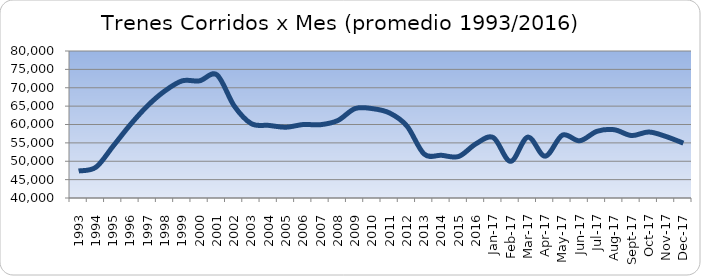
| Category | Series 0 |
|---|---|
| 1993.0 | 47344.667 |
| 1994.0 | 48375 |
| 1995.0 | 54141.667 |
| 1996.0 | 60006.5 |
| 1997.0 | 65151.083 |
| 1998.0 | 69168.25 |
| 1999.0 | 71890.333 |
| 2000.0 | 71885.417 |
| 2001.0 | 73530.667 |
| 2002.0 | 65076.167 |
| 2003.0 | 60220.083 |
| 2004.0 | 59758.083 |
| 2005.0 | 59257.083 |
| 2006.0 | 59994.083 |
| 2007.0 | 59947.667 |
| 2008.0 | 61081.083 |
| 2009.0 | 64336.917 |
| 2010.0 | 64321.917 |
| 2011.0 | 63128.917 |
| 2012.0 | 59598.583 |
| 2013.0 | 51948.667 |
| 2014.0 | 51618.583 |
| 2015.0 | 51310 |
| 2016.0 | 54764.75 |
| 42736.0 | 56441 |
| 42767.0 | 49969 |
| 42795.0 | 56570 |
| 42826.0 | 51381 |
| 42856.0 | 57107 |
| 42887.0 | 55567 |
| 42917.0 | 58143 |
| 42948.0 | 58582 |
| 42979.0 | 56996 |
| 43009.0 | 57957 |
| 43040.0 | 56723 |
| 43070.0 | 54923 |